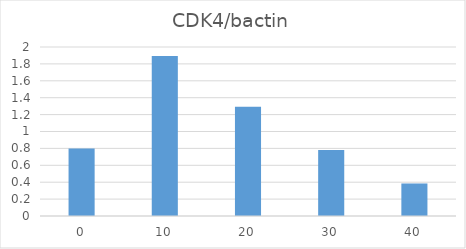
| Category | CDK4/bactin |
|---|---|
| 0.0 | 0.797 |
| 10.0 | 1.894 |
| 20.0 | 1.293 |
| 30.0 | 0.782 |
| 40.0 | 0.385 |